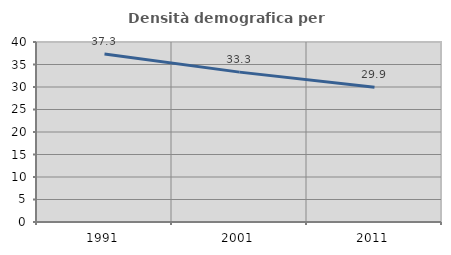
| Category | Densità demografica |
|---|---|
| 1991.0 | 37.346 |
| 2001.0 | 33.307 |
| 2011.0 | 29.95 |